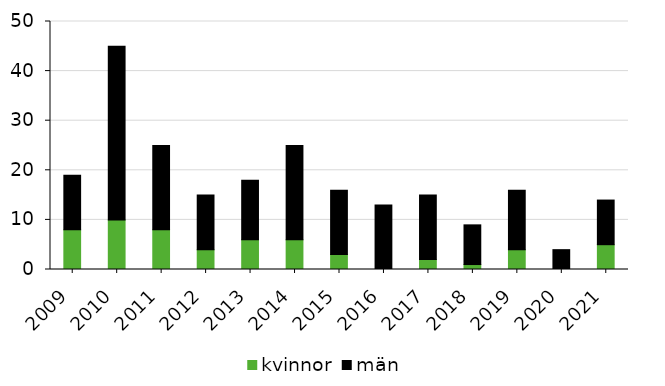
| Category | kvinnor | män |
|---|---|---|
| 2009 | 8 | 11 |
| 2010 | 10 | 35 |
| 2011 | 8 | 17 |
| 2012 | 4 | 11 |
| 2013 | 6 | 12 |
| 2014 | 6 | 19 |
| 2015 | 3 | 13 |
| 2016 | 0 | 13 |
| 2017 | 2 | 13 |
| 2018 | 1 | 8 |
| 2019 | 4 | 12 |
| 2020 | 0 | 4 |
| 2021 | 5 | 9 |